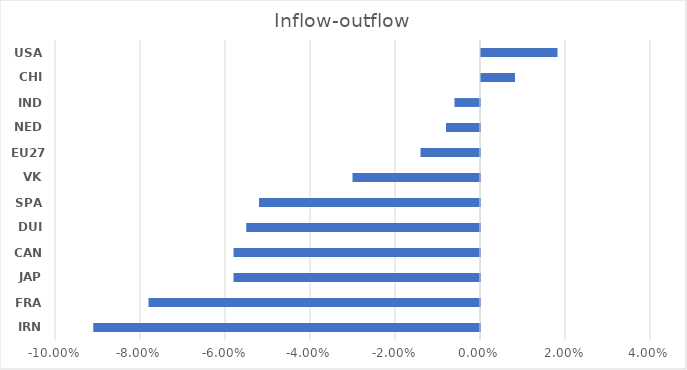
| Category | Inflow-outflow |
|---|---|
| IRN | -0.091 |
| FRA | -0.078 |
| JAP | -0.058 |
| CAN | -0.058 |
| DUI | -0.055 |
| SPA | -0.052 |
| VK | -0.03 |
| EU27 | -0.014 |
| NED | -0.008 |
| IND | -0.006 |
| CHI | 0.008 |
| USA | 0.018 |